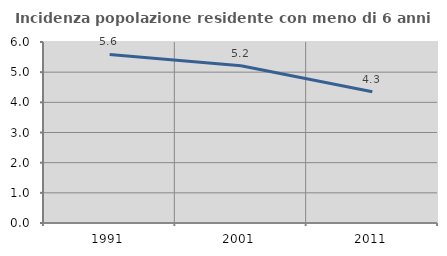
| Category | Incidenza popolazione residente con meno di 6 anni |
|---|---|
| 1991.0 | 5.587 |
| 2001.0 | 5.215 |
| 2011.0 | 4.35 |